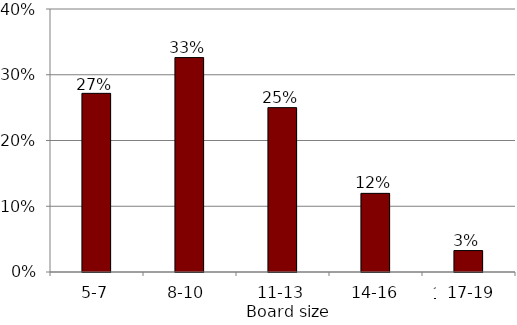
| Category | Series 0 |
|---|---|
| 5 to 7 | 0.272 |
| 8 to 10 | 0.326 |
| 11 to 13 | 0.25 |
| 14 to 16 | 0.12 |
| 17 to 19 | 0.033 |